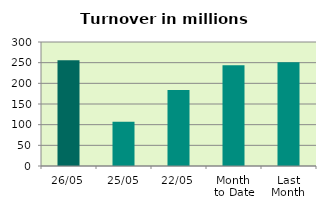
| Category | Series 0 |
|---|---|
| 26/05 | 255.652 |
| 25/05 | 107.194 |
| 22/05 | 183.646 |
| Month 
to Date | 243.949 |
| Last
Month | 250.745 |